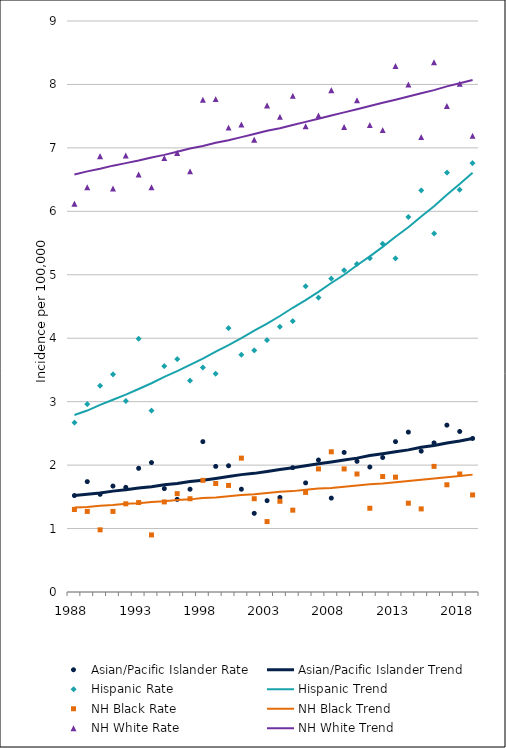
| Category | Asian/Pacific Islander Rate | Asian/Pacific Islander Trend | Hispanic Rate | Hispanic Trend | NH Black Rate | NH Black Trend | NH White Rate | NH White Trend |
|---|---|---|---|---|---|---|---|---|
| 1988.0 | 1.52 | 1.52 | 2.67 | 2.79 | 1.3 | 1.33 | 6.12 | 6.58 |
| 1989.0 | 1.74 | 1.54 | 2.96 | 2.86 | 1.27 | 1.34 | 6.38 | 6.63 |
| 1990.0 | 1.54 | 1.56 | 3.25 | 2.95 | 0.98 | 1.36 | 6.87 | 6.67 |
| 1991.0 | 1.67 | 1.59 | 3.43 | 3.03 | 1.27 | 1.37 | 6.36 | 6.72 |
| 1992.0 | 1.65 | 1.61 | 3.01 | 3.11 | 1.39 | 1.39 | 6.88 | 6.76 |
| 1993.0 | 1.95 | 1.64 | 3.99 | 3.2 | 1.41 | 1.4 | 6.58 | 6.8 |
| 1994.0 | 2.04 | 1.66 | 2.86 | 3.29 | 0.9 | 1.42 | 6.38 | 6.85 |
| 1995.0 | 1.63 | 1.69 | 3.56 | 3.39 | 1.42 | 1.43 | 6.84 | 6.89 |
| 1996.0 | 1.46 | 1.71 | 3.67 | 3.48 | 1.55 | 1.45 | 6.92 | 6.94 |
| 1997.0 | 1.62 | 1.74 | 3.33 | 3.58 | 1.47 | 1.46 | 6.63 | 6.99 |
| 1998.0 | 2.37 | 1.76 | 3.54 | 3.68 | 1.76 | 1.48 | 7.76 | 7.03 |
| 1999.0 | 1.98 | 1.79 | 3.44 | 3.79 | 1.71 | 1.49 | 7.77 | 7.08 |
| 2000.0 | 1.99 | 1.82 | 4.16 | 3.89 | 1.68 | 1.51 | 7.32 | 7.12 |
| 2001.0 | 1.62 | 1.85 | 3.74 | 4 | 2.11 | 1.53 | 7.37 | 7.17 |
| 2002.0 | 1.24 | 1.87 | 3.81 | 4.12 | 1.47 | 1.54 | 7.13 | 7.22 |
| 2003.0 | 1.44 | 1.9 | 3.97 | 4.23 | 1.11 | 1.56 | 7.67 | 7.27 |
| 2004.0 | 1.49 | 1.93 | 4.18 | 4.35 | 1.43 | 1.58 | 7.49 | 7.31 |
| 2005.0 | 1.96 | 1.96 | 4.27 | 4.48 | 1.29 | 1.59 | 7.82 | 7.36 |
| 2006.0 | 1.72 | 1.99 | 4.82 | 4.6 | 1.57 | 1.61 | 7.34 | 7.41 |
| 2007.0 | 2.08 | 2.02 | 4.64 | 4.73 | 1.94 | 1.63 | 7.51 | 7.46 |
| 2008.0 | 1.48 | 2.05 | 4.94 | 4.87 | 2.21 | 1.64 | 7.91 | 7.51 |
| 2009.0 | 2.2 | 2.08 | 5.07 | 5 | 1.94 | 1.66 | 7.33 | 7.56 |
| 2010.0 | 2.06 | 2.11 | 5.17 | 5.15 | 1.86 | 1.68 | 7.75 | 7.61 |
| 2011.0 | 1.97 | 2.15 | 5.26 | 5.29 | 1.32 | 1.7 | 7.36 | 7.66 |
| 2012.0 | 2.12 | 2.18 | 5.49 | 5.44 | 1.82 | 1.71 | 7.28 | 7.71 |
| 2013.0 | 2.37 | 2.21 | 5.26 | 5.6 | 1.81 | 1.73 | 8.29 | 7.76 |
| 2014.0 | 2.52 | 2.24 | 5.91 | 5.75 | 1.4 | 1.75 | 8 | 7.81 |
| 2015.0 | 2.22 | 2.28 | 6.33 | 5.92 | 1.31 | 1.77 | 7.17 | 7.86 |
| 2016.0 | 2.35 | 2.31 | 5.65 | 6.08 | 1.98 | 1.79 | 8.35 | 7.91 |
| 2017.0 | 2.63 | 2.35 | 6.61 | 6.26 | 1.69 | 1.81 | 7.66 | 7.97 |
| 2018.0 | 2.53 | 2.38 | 6.34 | 6.43 | 1.86 | 1.83 | 8.01 | 8.02 |
| 2019.0 | 2.42 | 2.42 | 6.76 | 6.61 | 1.53 | 1.85 | 7.19 | 8.07 |